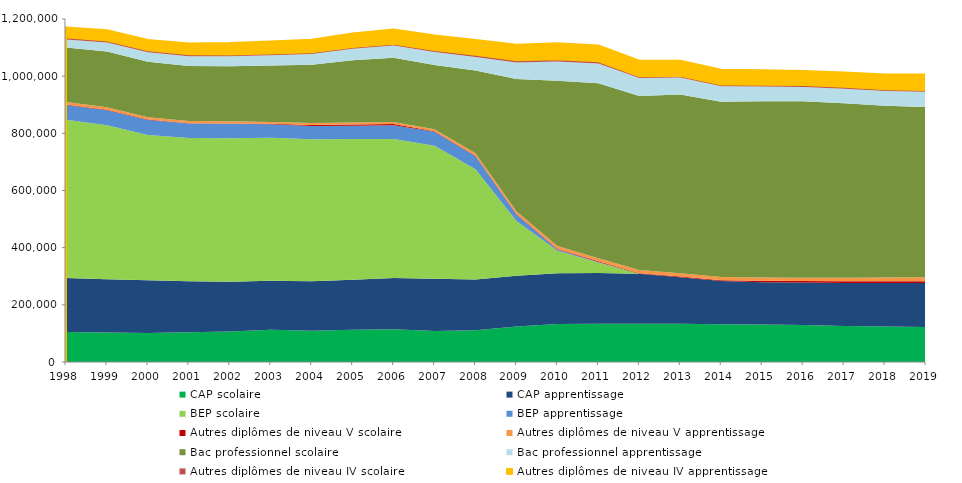
| Category | CAP scolaire | CAP apprentissage | BEP scolaire | BEP apprentissage | Autres diplômes de niveau V scolaire | Autres diplômes de niveau V apprentissage | Bac professionnel scolaire | Bac professionnel apprentissage | Autres diplômes de niveau IV scolaire | Autres diplômes de niveau IV apprentissage |
|---|---|---|---|---|---|---|---|---|---|---|
| 1998.0 | 104574 | 189646 | 553713 | 51282 | 1563 | 8958 | 190887 | 28002 | 6847 | 34620 |
| 1999.0 | 103372 | 186241 | 538375 | 53170 | 1296 | 8703 | 195392 | 30831 | 7271 | 35638 |
| 2000.0 | 101592 | 184025 | 508374 | 52974 | 1095 | 8362 | 193821 | 33404 | 6949 | 35951 |
| 2001.0 | 103963 | 178553 | 500784 | 51244 | 1122 | 7691 | 192349 | 34317 | 6503 | 37511 |
| 2002.0 | 107005 | 174188 | 501654 | 50395 | 1227 | 7583 | 192612 | 35047 | 6245 | 39755 |
| 2003.0 | 113100 | 171367 | 499806 | 47490 | 1421 | 6478 | 197552 | 35900 | 6455 | 41462 |
| 2004.0 | 109531 | 172565 | 496815 | 46467 | 4210 | 6242 | 204376 | 37112 | 6472 | 43511 |
| 2005.0 | 112412 | 175002 | 492932 | 46554 | 4318 | 7057 | 217510 | 39820 | 6555 | 46789 |
| 2006.0 | 114178 | 179940 | 485956 | 48254 | 4544 | 7197 | 224425 | 42709 | 6415 | 49242 |
| 2007.0 | 108078 | 183038 | 465852 | 48604 | 1398 | 7652 | 224584 | 44995 | 7657 | 50758 |
| 2008.0 | 110880 | 177578 | 386084 | 45600 | 1743 | 8481 | 289715 | 46884 | 7875 | 51586 |
| 2009.0 | 124628 | 177290 | 191441 | 22539 | 1599 | 9938 | 462573 | 57638 | 8250 | 54262 |
| 2010.0 | 133173 | 176956 | 78847 | 4320 | 2279 | 10581 | 577803 | 67020 | 7773 | 55998 |
| 2011.0 | 133827 | 177298 | 37044 | 1763 | 2256 | 10499 | 612860 | 68636 | 7708 | 55252 |
| 2012.0 | 133753 | 174740 | 0 | 0 | 2336 | 11135 | 608589 | 62875 | 6279 | 54022 |
| 2013.0 | 133449 | 163381 | 0 | 0 | 2283 | 11273 | 625697 | 58905 | 6279 | 52777 |
| 2014.0 | 132505 | 150810 | 0 | 0 | 2320 | 11416 | 613842 | 53697 | 6459 | 51183 |
| 2015.0 | 130970 | 148184 | 0 | 0 | 5262 | 11426 | 616459 | 51112 | 6688 | 50470 |
| 2016.0 | 129362 | 148436 | 0 | 0 | 5708 | 11562 | 617385 | 50073 | 6177 | 49741 |
| 2017.0 | 125997 | 150168 | 0 | 0 | 6010 | 12482 | 610899 | 50843 | 6278 | 50109 |
| 2018.0 | 124036 | 152268 | 0 | 0 | 6399 | 12606 | 601192 | 51859 | 6056 | 51594 |
| 2019.0 | 122368 | 154093 | 0 | 0 | 6480 | 13609 | 595607 | 53594 | 6182 | 53661 |